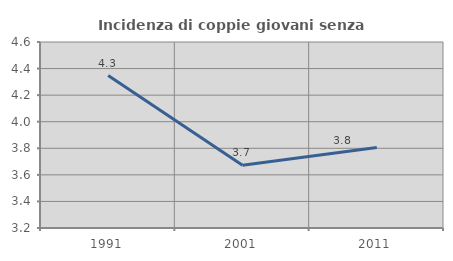
| Category | Incidenza di coppie giovani senza figli |
|---|---|
| 1991.0 | 4.348 |
| 2001.0 | 3.672 |
| 2011.0 | 3.807 |